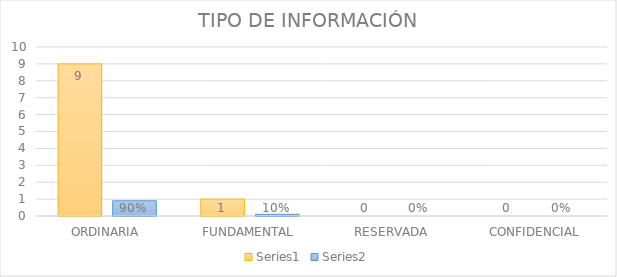
| Category | Series 3 | Series 4 |
|---|---|---|
| ORDINARIA | 9 | 0.9 |
| FUNDAMENTAL | 1 | 0.1 |
| RESERVADA | 0 | 0 |
| CONFIDENCIAL | 0 | 0 |